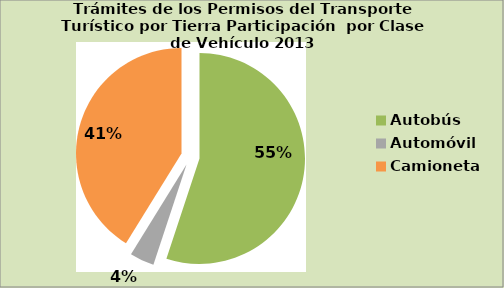
| Category | Series 0 |
|---|---|
| Autobús | 55.079 |
| Automóvil | 3.738 |
| Camioneta | 41.183 |